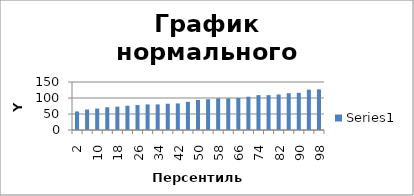
| Category | Series 0 |
|---|---|
| 2.0 | 58 |
| 6.0 | 64 |
| 10.0 | 67 |
| 14.0 | 71 |
| 18.0 | 73 |
| 22.0 | 76 |
| 26.0 | 78 |
| 30.0 | 80 |
| 34.0 | 80 |
| 38.0 | 82 |
| 42.0 | 83 |
| 46.0 | 88 |
| 50.0 | 94 |
| 54.0 | 96 |
| 58.0 | 99 |
| 62.0 | 99 |
| 66.0 | 100 |
| 70.0 | 104 |
| 74.0 | 109 |
| 78.0 | 109 |
| 82.0 | 111 |
| 86.0 | 115 |
| 90.0 | 116 |
| 94.0 | 126 |
| 98.0 | 127 |